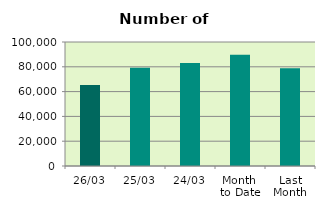
| Category | Series 0 |
|---|---|
| 26/03 | 65346 |
| 25/03 | 79152 |
| 24/03 | 83118 |
| Month 
to Date | 89695.6 |
| Last
Month | 78748.7 |